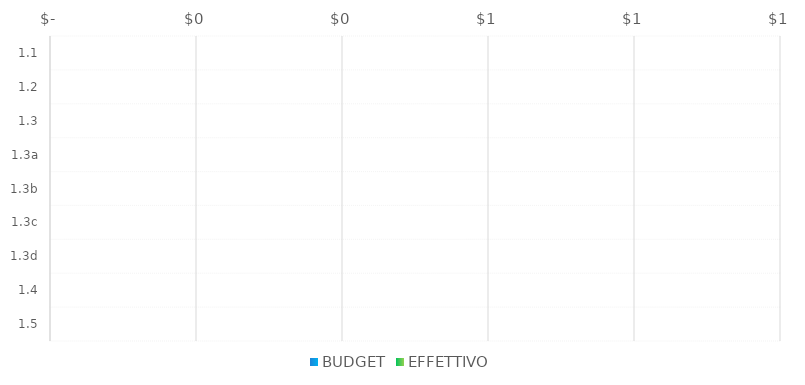
| Category | BUDGET | EFFETTIVO |
|---|---|---|
| 1.1 |  | 0 |
| 1.2 |  | 0 |
| 1.3 |  | 0 |
| 1.3a |  | 0 |
| 1.3b |  | 0 |
| 1.3c |  | 0 |
| 1.3d |  | 0 |
| 1.4 |  | 0 |
| 1.5 |  | 0 |